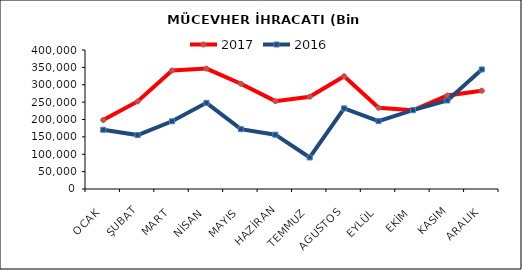
| Category | 2017 | 2016 |
|---|---|---|
| OCAK | 198534.063 | 170447.061 |
| ŞUBAT | 251919.777 | 155181.198 |
| MART | 341066.068 | 194886.801 |
| NİSAN | 346426.989 | 247906.689 |
| MAYIS | 302911.305 | 172098.346 |
| HAZİRAN | 252788.034 | 156340.5 |
| TEMMUZ | 265586.781 | 90793 |
| AGUSTOS | 324499.217 | 232009.071 |
| EYLÜL | 233708.932 | 195280.358 |
| EKİM | 226573.093 | 226982.834 |
| KASIM | 268917.092 | 254790.541 |
| ARALIK | 282885.239 | 344032.966 |